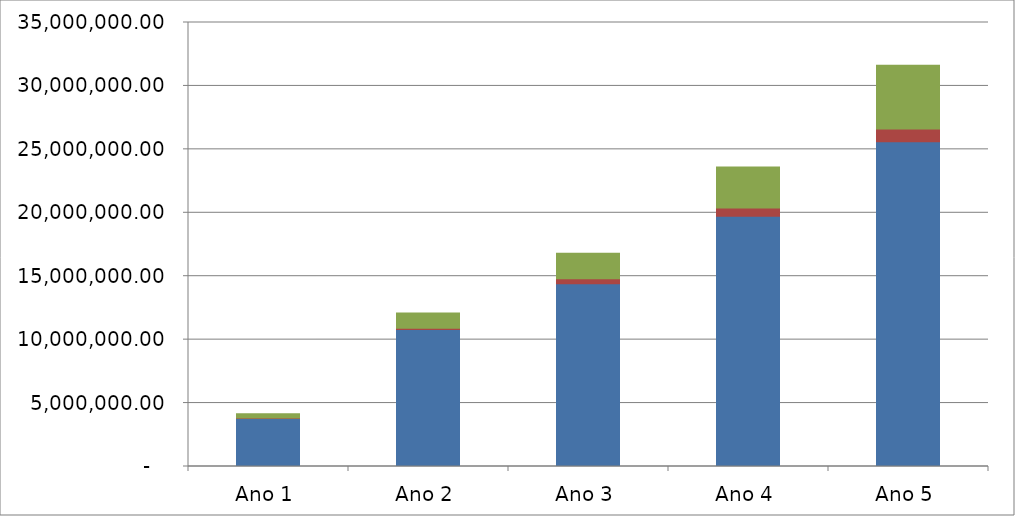
| Category | Alimentação | Produtos consignados | Produtos Brazil Experience | Series 3 | Series 4 | Series 5 |
|---|---|---|---|---|---|---|
| Ano 1 | 3780000 | 39690 | 340200 |  |  |  |
| Ano 2 | 10800000 | 90720 | 1209600 |  |  |  |
| Ano 3 | 14400000 | 403200 | 2016000 |  |  |  |
| Ano 4 | 19733333.333 | 645120 | 3225600 |  |  |  |
| Ano 5 | 25600000 | 1003520 | 5017600 |  |  |  |